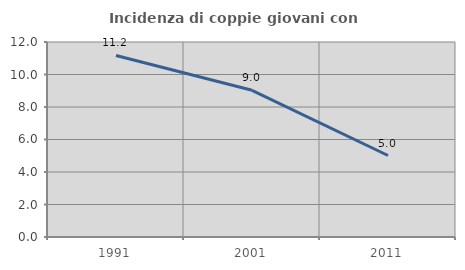
| Category | Incidenza di coppie giovani con figli |
|---|---|
| 1991.0 | 11.171 |
| 2001.0 | 9.028 |
| 2011.0 | 5.014 |